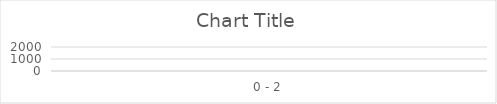
| Category | Series 0 |
|---|---|
| 0 - 2 | 1000 |